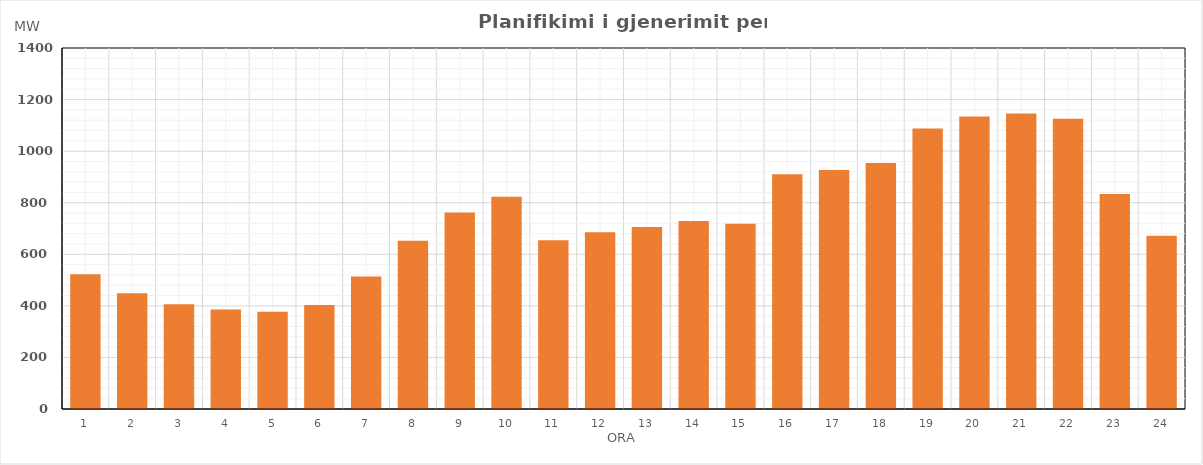
| Category | Max (MW) |
|---|---|
| 0 | 522.38 |
| 1 | 448.75 |
| 2 | 405.82 |
| 3 | 385.84 |
| 4 | 377.42 |
| 5 | 403.7 |
| 6 | 514.32 |
| 7 | 652.55 |
| 8 | 761.65 |
| 9 | 823.44 |
| 10 | 654.66 |
| 11 | 685.05 |
| 12 | 706.14 |
| 13 | 729.12 |
| 14 | 718.24 |
| 15 | 910.19 |
| 16 | 927.3 |
| 17 | 953.74 |
| 18 | 1087.54 |
| 19 | 1134.25 |
| 20 | 1145.78 |
| 21 | 1125.88 |
| 22 | 833.98 |
| 23 | 671.68 |